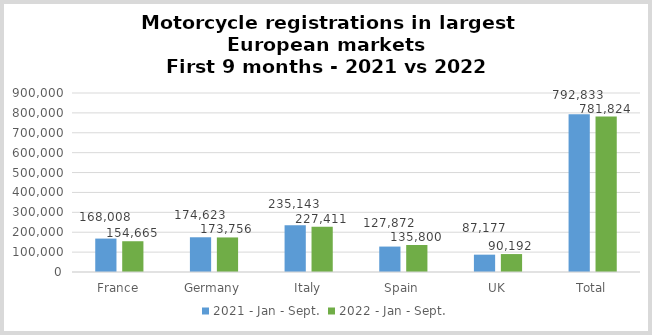
| Category | 2021 - Jan - Sept. | 2022 - Jan - Sept. |
|---|---|---|
| France | 168008 | 154665 |
| Germany | 174623 | 173756 |
| Italy | 235143 | 227411 |
| Spain | 127872 | 135800 |
| UK | 87177 | 90192 |
| Total | 792833 | 781824 |